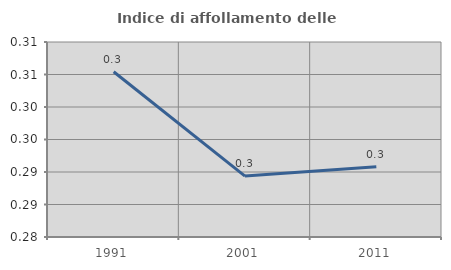
| Category | Indice di affollamento delle abitazioni  |
|---|---|
| 1991.0 | 0.305 |
| 2001.0 | 0.289 |
| 2011.0 | 0.291 |